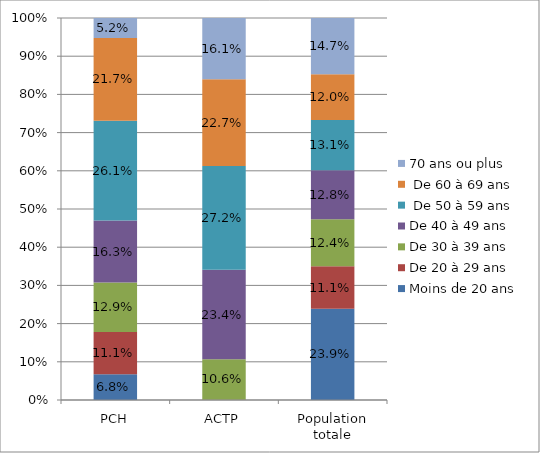
| Category | Moins de 20 ans  | De 20 à 29 ans | De 30 à 39 ans | De 40 à 49 ans |  De 50 à 59 ans |  De 60 à 69 ans | 70 ans ou plus |
|---|---|---|---|---|---|---|---|
| PCH | 0.068 | 0.111 | 0.129 | 0.163 | 0.261 | 0.217 | 0.052 |
| ACTP | 0 | 0.001 | 0.106 | 0.234 | 0.272 | 0.227 | 0.161 |
| Population totale | 0.239 | 0.111 | 0.124 | 0.128 | 0.131 | 0.12 | 0.147 |